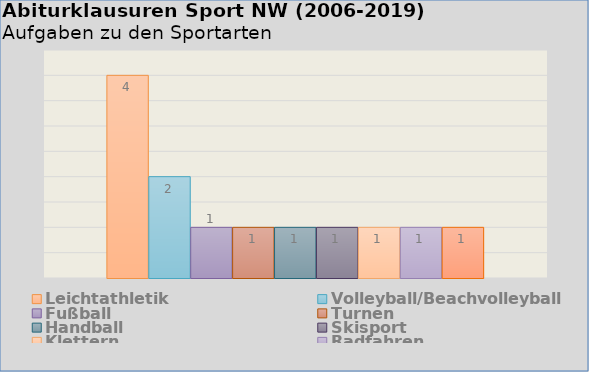
| Category | Leichtathletik | Volleyball/Beachvolleyball | Fußball | Turnen | Handball | Skisport | Klettern | Kampfsport | Radfahren | Joggen/Nordic Walking |
|---|---|---|---|---|---|---|---|---|---|---|
| Leichtathletik | 4 | 2 | 1 | 1 | 1 | 1 | 1 |  | 1 | 1 |